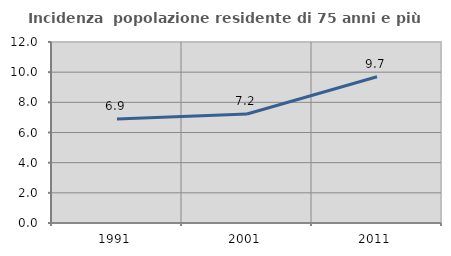
| Category | Incidenza  popolazione residente di 75 anni e più |
|---|---|
| 1991.0 | 6.888 |
| 2001.0 | 7.227 |
| 2011.0 | 9.699 |